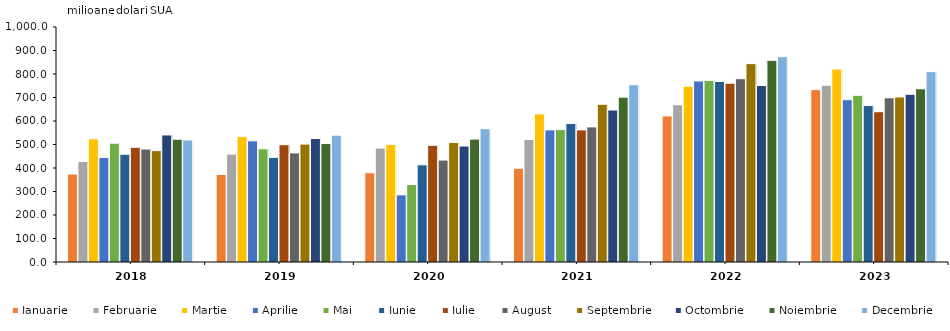
| Category | Ianuarie | Februarie | Martie | Aprilie | Mai | Iunie | Iulie | August | Septembrie | Octombrie | Noiembrie | Decembrie |
|---|---|---|---|---|---|---|---|---|---|---|---|---|
| 2018.0 | 374.3 | 427.6 | 524.1 | 444.6 | 505.6 | 458.7 | 488 | 480.7 | 474 | 540.6 | 522.6 | 519.3 |
| 2019.0 | 372.6 | 459.3 | 533.8 | 515.6 | 481.6 | 445.4 | 499.1 | 464.3 | 501.7 | 525.3 | 504.1 | 539.7 |
| 2020.0 | 379.8 | 484.8 | 500.5 | 285.6 | 329.4 | 413.5 | 496.6 | 433.6 | 508.3 | 493.6 | 522.9 | 567.3 |
| 2021.0 | 399.4 | 521.4 | 630.1 | 562.2 | 563.4 | 589.6 | 562 | 574.9 | 671.2 | 646.8 | 701.5 | 754.2 |
| 2022.0 | 621.7 | 669.1 | 748.3 | 770.4 | 772.7 | 768.4 | 761.1 | 780 | 844.1 | 751.1 | 858.3 | 873.8 |
| 2023.0 | 733.3 | 752.5 | 821.1 | 690.6 | 709.2 | 665.6 | 639.5 | 698.9 | 702.2 | 713.7 | 737.1 | 810 |